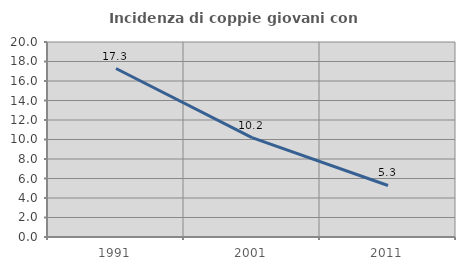
| Category | Incidenza di coppie giovani con figli |
|---|---|
| 1991.0 | 17.28 |
| 2001.0 | 10.188 |
| 2011.0 | 5.285 |